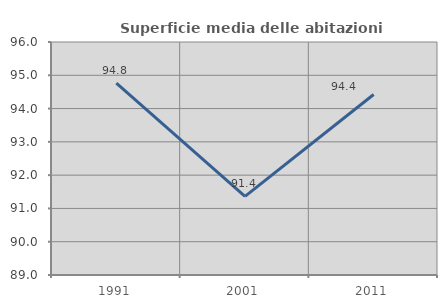
| Category | Superficie media delle abitazioni occupate |
|---|---|
| 1991.0 | 94.763 |
| 2001.0 | 91.363 |
| 2011.0 | 94.424 |